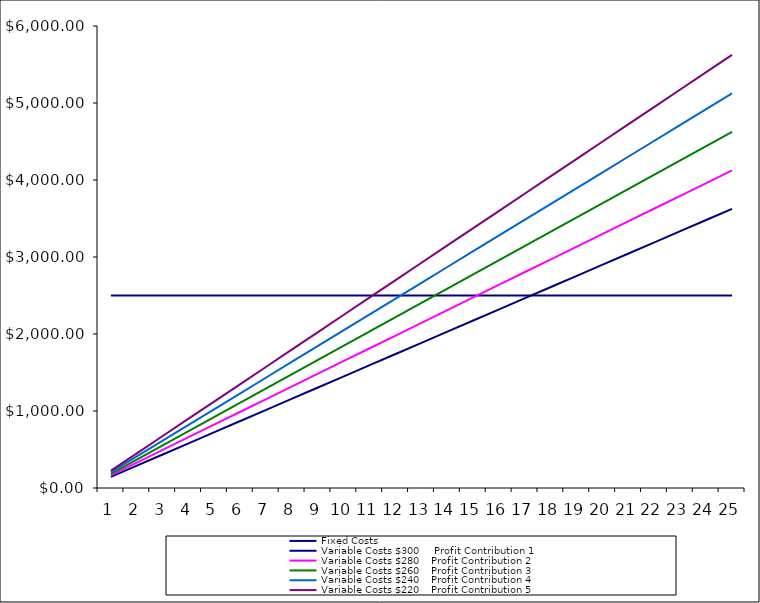
| Category | Fixed Costs | Variable Costs $300     Profit Contribution 1 | Variable Costs $280    Profit Contribution 2 | Variable Costs $260    Profit Contribution 3 | Variable Costs $240    Profit Contribution 4 | Variable Costs $220    Profit Contribution 5 |
|---|---|---|---|---|---|---|
| 0 | 2500 | 145 | 165 | 185 | 205 | 225 |
| 1 | 2500 | 290 | 330 | 370 | 410 | 450 |
| 2 | 2500 | 435 | 495 | 555 | 615 | 675 |
| 3 | 2500 | 580 | 660 | 740 | 820 | 900 |
| 4 | 2500 | 725 | 825 | 925 | 1025 | 1125 |
| 5 | 2500 | 870 | 990 | 1110 | 1230 | 1350 |
| 6 | 2500 | 1015 | 1155 | 1295 | 1435 | 1575 |
| 7 | 2500 | 1160 | 1320 | 1480 | 1640 | 1800 |
| 8 | 2500 | 1305 | 1485 | 1665 | 1845 | 2025 |
| 9 | 2500 | 1450 | 1650 | 1850 | 2050 | 2250 |
| 10 | 2500 | 1595 | 1815 | 2035 | 2255 | 2475 |
| 11 | 2500 | 1740 | 1980 | 2220 | 2460 | 2700 |
| 12 | 2500 | 1885 | 2145 | 2405 | 2665 | 2925 |
| 13 | 2500 | 2030 | 2310 | 2590 | 2870 | 3150 |
| 14 | 2500 | 2175 | 2475 | 2775 | 3075 | 3375 |
| 15 | 2500 | 2320 | 2640 | 2960 | 3280 | 3600 |
| 16 | 2500 | 2465 | 2805 | 3145 | 3485 | 3825 |
| 17 | 2500 | 2610 | 2970 | 3330 | 3690 | 4050 |
| 18 | 2500 | 2755 | 3135 | 3515 | 3895 | 4275 |
| 19 | 2500 | 2900 | 3300 | 3700 | 4100 | 4500 |
| 20 | 2500 | 3045 | 3465 | 3885 | 4305 | 4725 |
| 21 | 2500 | 3190 | 3630 | 4070 | 4510 | 4950 |
| 22 | 2500 | 3335 | 3795 | 4255 | 4715 | 5175 |
| 23 | 2500 | 3480 | 3960 | 4440 | 4920 | 5400 |
| 24 | 2500 | 3625 | 4125 | 4625 | 5125 | 5625 |